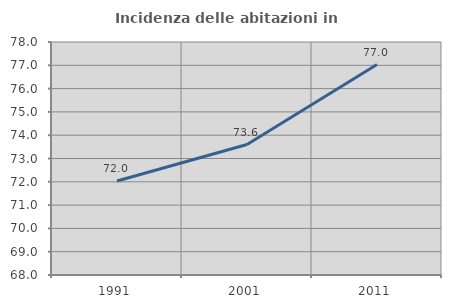
| Category | Incidenza delle abitazioni in proprietà  |
|---|---|
| 1991.0 | 72.034 |
| 2001.0 | 73.6 |
| 2011.0 | 77.032 |